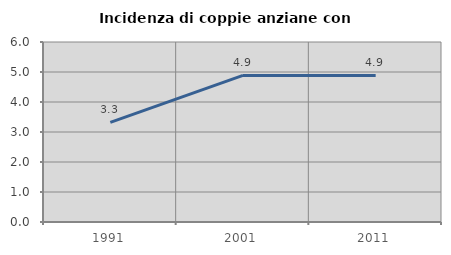
| Category | Incidenza di coppie anziane con figli |
|---|---|
| 1991.0 | 3.32 |
| 2001.0 | 4.885 |
| 2011.0 | 4.886 |